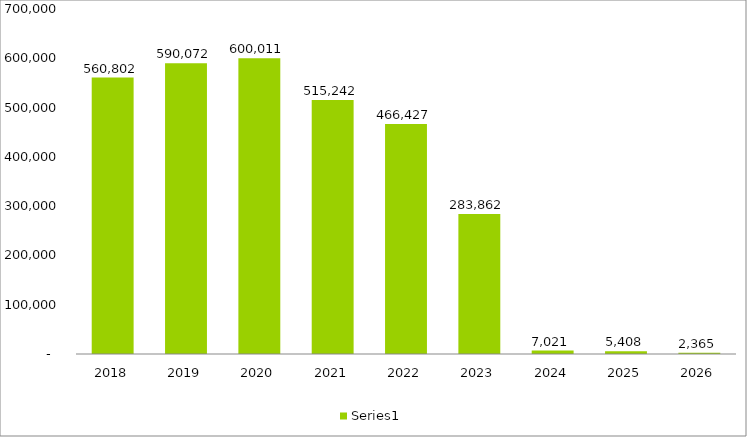
| Category | Series 0 |
|---|---|
| 2018 | 560802.271 |
| 2019 | 590071.67 |
| 2020 | 600011.202 |
| 2021 | 515242.307 |
| 2022 | 466426.796 |
| 2023 | 283861.601 |
| 2024 | 7021.369 |
| 2025 | 5407.91 |
| 2026 | 2364.721 |